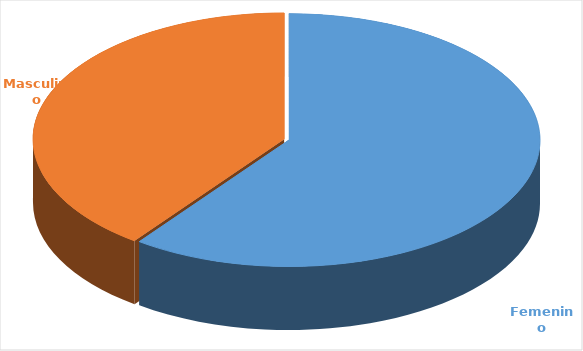
| Category | Cantidad  |
|---|---|
| Femenino | 3706 |
| Masculino | 2455 |